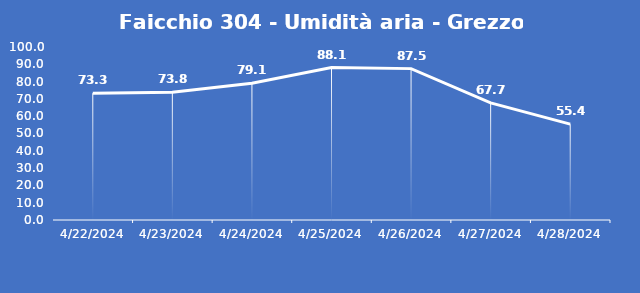
| Category | Faicchio 304 - Umidità aria - Grezzo (%) |
|---|---|
| 4/22/24 | 73.3 |
| 4/23/24 | 73.8 |
| 4/24/24 | 79.1 |
| 4/25/24 | 88.1 |
| 4/26/24 | 87.5 |
| 4/27/24 | 67.7 |
| 4/28/24 | 55.4 |